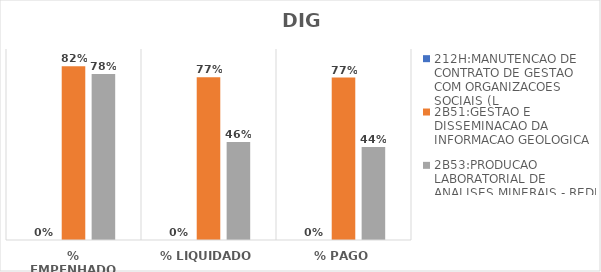
| Category | 212H:MANUTENCAO DE CONTRATO DE GESTAO COM ORGANIZACOES SOCIAIS (L | 2B51:GESTAO E DISSEMINACAO DA INFORMACAO GEOLOGICA | 2B53:PRODUCAO LABORATORIAL DE ANALISES MINERAIS - REDE LAMIN |
|---|---|---|---|
| % EMPENHADO | 0 | 0.818 | 0.782 |
| % LIQUIDADO | 0 | 0.767 | 0.461 |
| % PAGO | 0 | 0.765 | 0.439 |